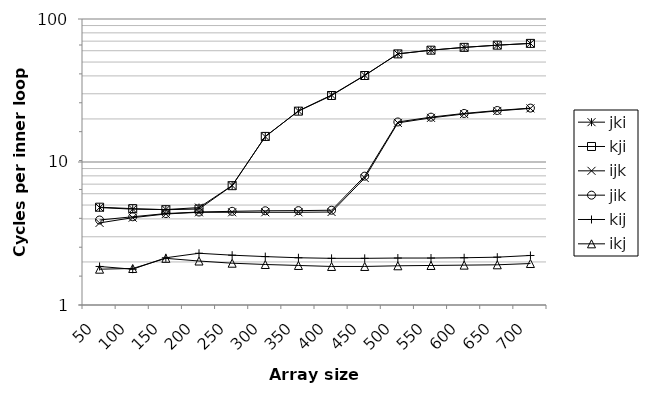
| Category | jki | kji | ijk | jik | kij | ikj |
|---|---|---|---|---|---|---|
| 50.0 | 4.8 | 4.83 | 3.75 | 3.93 | 1.86 | 1.78 |
| 100.0 | 4.68 | 4.72 | 4.08 | 4.14 | 1.78 | 1.8 |
| 150.0 | 4.65 | 4.64 | 4.33 | 4.36 | 2.14 | 2.12 |
| 200.0 | 4.8 | 4.69 | 4.45 | 4.47 | 2.3 | 2.03 |
| 250.0 | 6.84 | 6.83 | 4.45 | 4.52 | 2.23 | 1.96 |
| 300.0 | 15.03 | 15.1 | 4.45 | 4.56 | 2.18 | 1.92 |
| 350.0 | 22.78 | 22.68 | 4.45 | 4.57 | 2.14 | 1.89 |
| 400.0 | 29.39 | 29.18 | 4.47 | 4.6 | 2.12 | 1.86 |
| 450.0 | 40.39 | 40.26 | 7.73 | 7.96 | 2.12 | 1.86 |
| 500.0 | 57.06 | 57.02 | 18.77 | 19.05 | 2.13 | 1.88 |
| 550.0 | 60.54 | 60.53 | 20.36 | 20.59 | 2.13 | 1.89 |
| 600.0 | 63.33 | 63.34 | 21.67 | 21.86 | 2.14 | 1.9 |
| 650.0 | 65.61 | 65.62 | 22.76 | 22.92 | 2.16 | 1.91 |
| 700.0 | 67.49 | 67.53 | 23.71 | 23.82 | 2.22 | 1.95 |